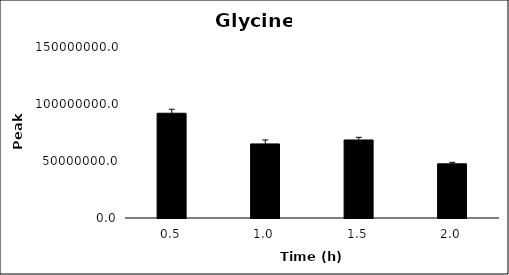
| Category | Series 0 |
|---|---|
| 0.5 | 91887102 |
| 1.0 | 64986814.667 |
| 1.5 | 68446628.333 |
| 2.0 | 47504073 |